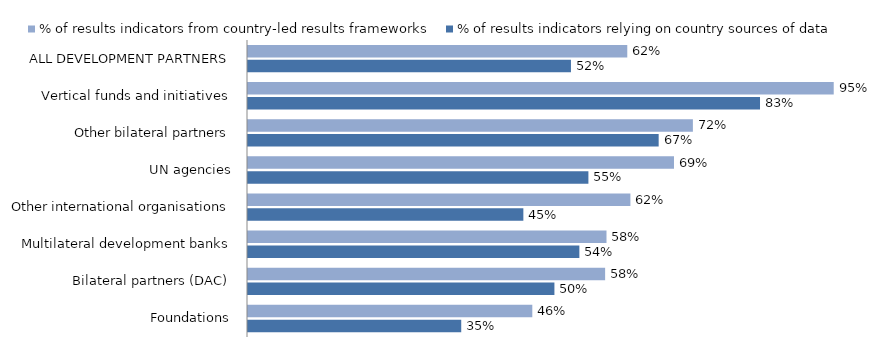
| Category | % of results indicators from country-led results frameworks | % of results indicators relying on country sources of data |
|---|---|---|
| ALL DEVELOPMENT PARTNERS | 0.616 | 0.524 |
| Vertical funds and initiatives | 0.951 | 0.831 |
| Other bilateral partners | 0.722 | 0.667 |
| UN agencies | 0.692 | 0.553 |
| Other international organisations | 0.621 | 0.447 |
| Multilateral development banks | 0.582 | 0.538 |
| Bilateral partners (DAC) | 0.58 | 0.497 |
| Foundations | 0.462 | 0.346 |